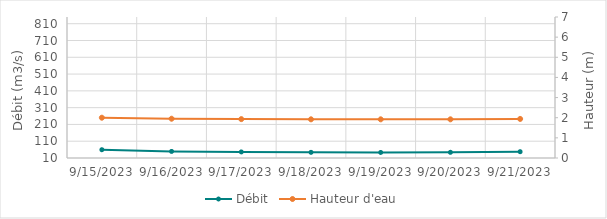
| Category | Débit |
|---|---|
| 5/11/23 | 460.97 |
| 5/10/23 | 454.54 |
| 5/9/23 | 470.5 |
| 5/8/23 | 406.35 |
| 5/7/23 | 363.18 |
| 5/6/23 | 265.45 |
| 5/5/23 | 240.06 |